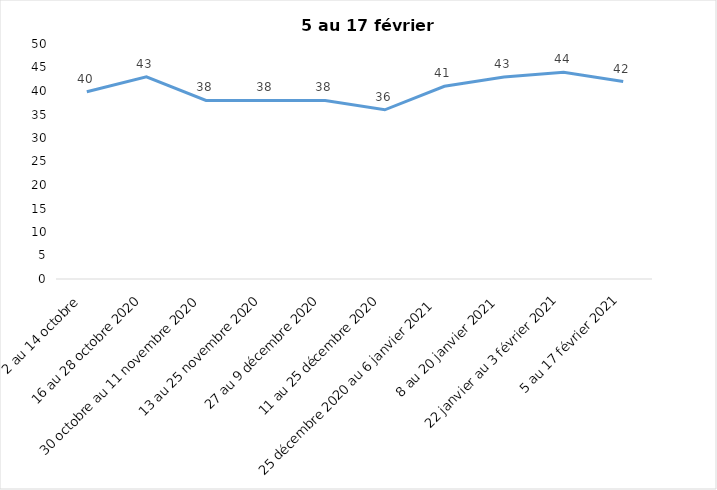
| Category | Toujours aux trois mesures |
|---|---|
| 2 au 14 octobre  | 39.85 |
| 16 au 28 octobre 2020 | 43 |
| 30 octobre au 11 novembre 2020 | 38 |
| 13 au 25 novembre 2020 | 38 |
| 27 au 9 décembre 2020 | 38 |
| 11 au 25 décembre 2020 | 36 |
| 25 décembre 2020 au 6 janvier 2021 | 41 |
| 8 au 20 janvier 2021 | 43 |
| 22 janvier au 3 février 2021 | 44 |
| 5 au 17 février 2021 | 42 |